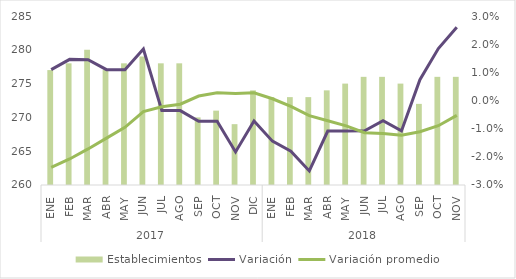
| Category | Establecimientos |
|---|---|
| 0 | 277 |
| 1 | 278 |
| 2 | 280 |
| 3 | 277 |
| 4 | 278 |
| 5 | 279 |
| 6 | 278 |
| 7 | 278 |
| 8 | 270 |
| 9 | 271 |
| 10 | 269 |
| 11 | 274 |
| 12 | 273 |
| 13 | 273 |
| 14 | 273 |
| 15 | 274 |
| 16 | 275 |
| 17 | 276 |
| 18 | 276 |
| 19 | 275 |
| 20 | 272 |
| 21 | 276 |
| 22 | 276 |